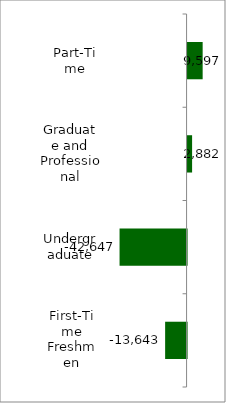
| Category | 50 states and D.C. |
|---|---|
| First-Time Freshmen | -13643 |
| Undergraduate | -42647 |
| Graduate and Professional | 2882 |
| Part-Time | 9597 |